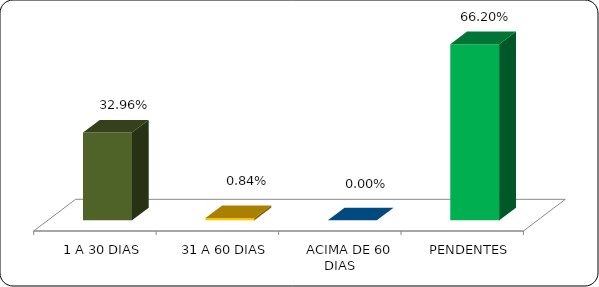
| Category | Series 0 |
|---|---|
|      1 A 30 DIAS | 0.33 |
|      31 A 60 DIAS | 0.008 |
|      ACIMA DE 60 DIAS | 0 |
|      PENDENTES | 0.662 |